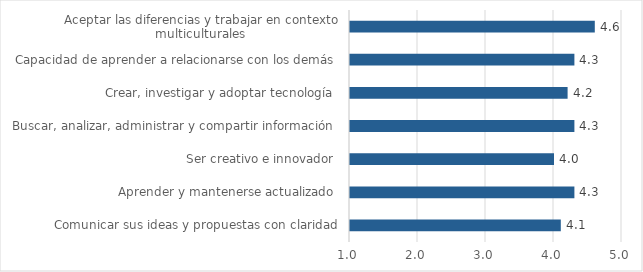
| Category | Series 5 | Promedio |
|---|---|---|
| Comunicar sus ideas y propuestas con claridad |  | 4.1 |
| Aprender y mantenerse actualizado  |  | 4.3 |
| Ser creativo e innovador  |  | 4 |
| Buscar, analizar, administrar y compartir información  |  | 4.3 |
| Crear, investigar y adoptar tecnología  |  | 4.2 |
| Capacidad de aprender a relacionarse con los demás  |  | 4.3 |
| Aceptar las diferencias y trabajar en contexto multiculturales  |  | 4.6 |